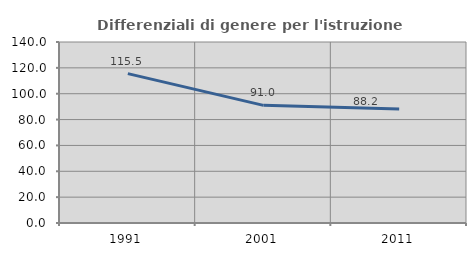
| Category | Differenziali di genere per l'istruzione superiore |
|---|---|
| 1991.0 | 115.532 |
| 2001.0 | 90.985 |
| 2011.0 | 88.209 |